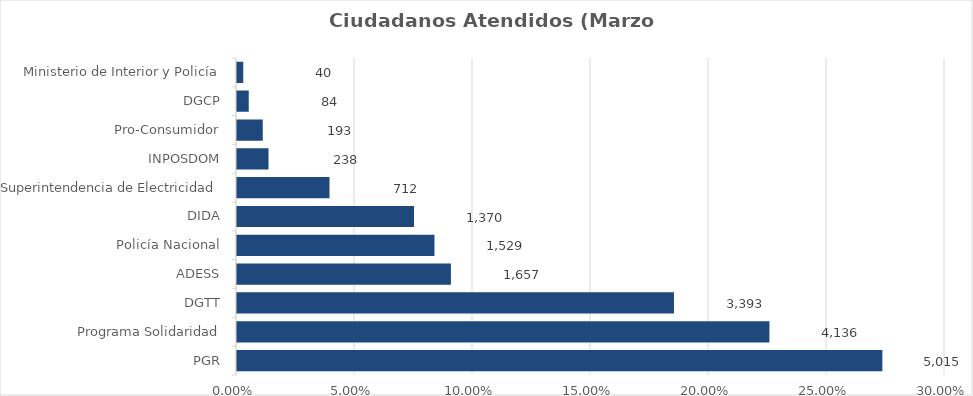
| Category | Porcentaje |
|---|---|
| PGR | 0.273 |
| Programa Solidaridad | 0.225 |
| DGTT | 0.185 |
| ADESS | 0.09 |
| Policía Nacional | 0.083 |
| DIDA | 0.075 |
| Superintendencia de Electricidad | 0.039 |
| INPOSDOM | 0.013 |
| Pro-Consumidor | 0.011 |
| DGCP | 0.005 |
| Ministerio de Interior y Policía | 0.002 |